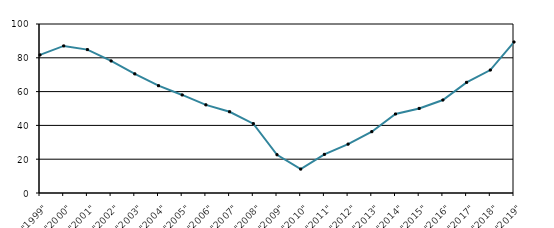
| Category | Series 1 |
|---|---|
| "1999" | 81.693 |
| "2000" | 87.026 |
| "2001" | 84.841 |
| "2002" | 78.14 |
| "2003" | 70.488 |
| "2004" | 63.486 |
| "2005" | 58.019 |
| "2006" | 52.153 |
| "2007" | 48.074 |
| "2008" | 41.026 |
| "2009" | 22.636 |
| "2010" | 14.148 |
| "2011" | 22.867 |
| "2012" | 28.927 |
| "2013" | 36.282 |
| "2014" | 46.751 |
| "2015" | 50.05 |
| "2016" | 55.027 |
| "2017" | 65.482 |
| "2018" | 72.756 |
| "2019" | 89.339 |